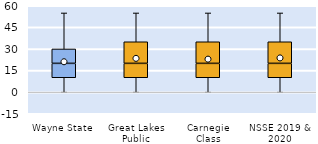
| Category | 25th | 50th | 75th |
|---|---|---|---|
| Wayne State | 10 | 10 | 10 |
| Great Lakes Public | 10 | 10 | 15 |
| Carnegie Class | 10 | 10 | 15 |
| NSSE 2019 & 2020 | 10 | 10 | 15 |